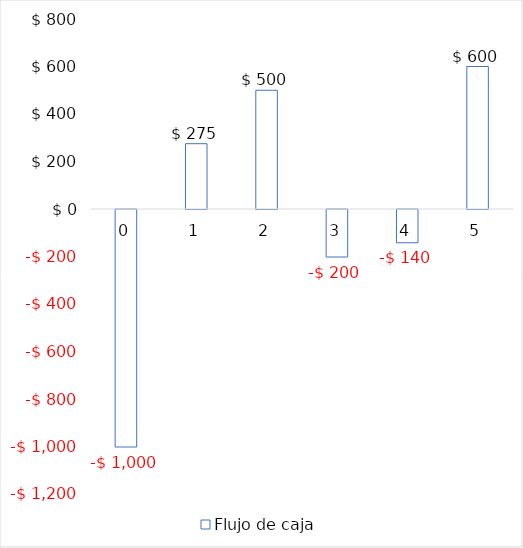
| Category |  Flujo de caja  |
|---|---|
| 0.0 | -1000 |
| 1.0 | 275 |
| 2.0 | 500 |
| 3.0 | -200 |
| 4.0 | -140 |
| 5.0 | 600 |